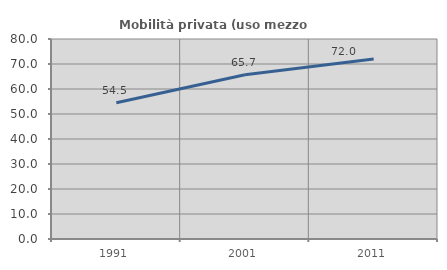
| Category | Mobilità privata (uso mezzo privato) |
|---|---|
| 1991.0 | 54.525 |
| 2001.0 | 65.71 |
| 2011.0 | 72.025 |